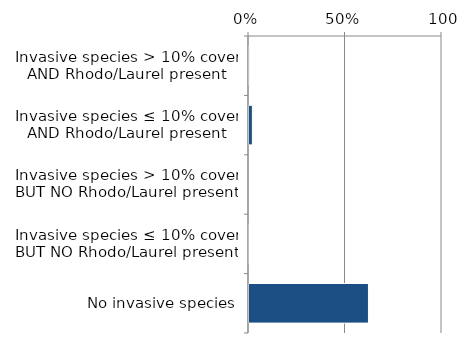
| Category | Non native |
|---|---|
| No invasive species | 0.624 |
| Invasive species ≤ 10% cover BUT NO Rhodo/Laurel present | 0.001 |
| Invasive species > 10% cover BUT NO Rhodo/Laurel present | 0 |
| Invasive species ≤ 10% cover AND Rhodo/Laurel present | 0.023 |
| Invasive species > 10% cover AND Rhodo/Laurel present | 0.006 |